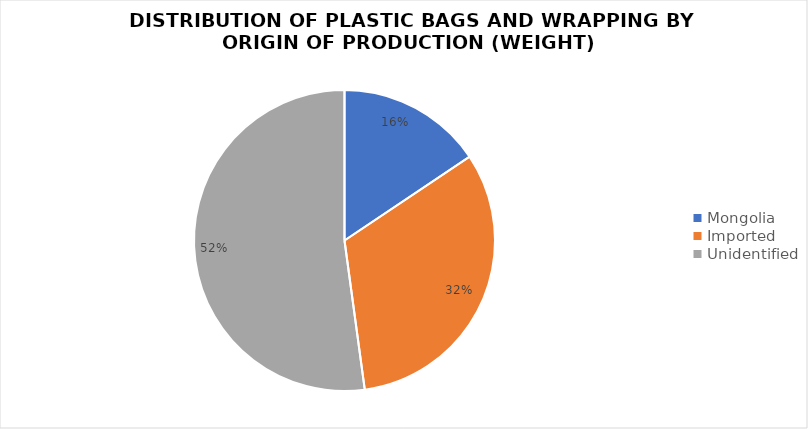
| Category | Series 0 |
|---|---|
| Mongolia | 27.12 |
| Imported | 56.049 |
| Unidentified | 90.65 |